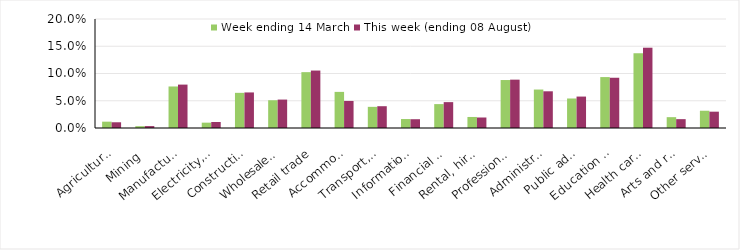
| Category | Week ending 14 March | This week (ending 08 August) |
|---|---|---|
| Agriculture, forestry and fishing | 0.012 | 0.011 |
| Mining | 0.003 | 0.004 |
| Manufacturing | 0.076 | 0.08 |
| Electricity, gas, water and waste services | 0.01 | 0.011 |
| Construction | 0.065 | 0.065 |
| Wholesale trade | 0.051 | 0.052 |
| Retail trade | 0.102 | 0.105 |
| Accommodation and food services | 0.066 | 0.05 |
| Transport, postal and warehousing | 0.039 | 0.04 |
| Information media and telecommunications | 0.016 | 0.016 |
| Financial and insurance services | 0.044 | 0.047 |
| Rental, hiring and real estate services | 0.02 | 0.019 |
| Professional, scientific and technical services | 0.088 | 0.089 |
| Administrative and support services | 0.071 | 0.067 |
| Public administration and safety | 0.054 | 0.058 |
| Education and training | 0.093 | 0.092 |
| Health care and social assistance | 0.137 | 0.147 |
| Arts and recreation services | 0.02 | 0.016 |
| Other services | 0.032 | 0.03 |